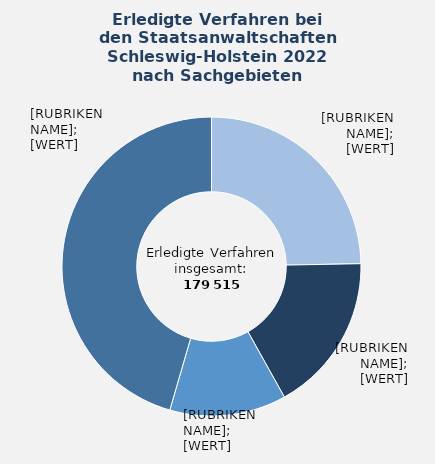
| Category | in Prozent |
|---|---|
| Sonstige allgemeine Straftaten | 24.7 |
| Betrug und Untreue | 17.2 |
| Diebstahl und Unterschlagung | 12.6 |
| Übrige Sachgebiete¹ | 45.5 |